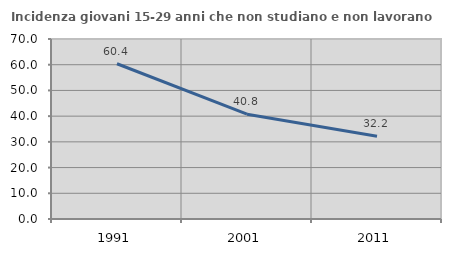
| Category | Incidenza giovani 15-29 anni che non studiano e non lavorano  |
|---|---|
| 1991.0 | 60.38 |
| 2001.0 | 40.756 |
| 2011.0 | 32.194 |